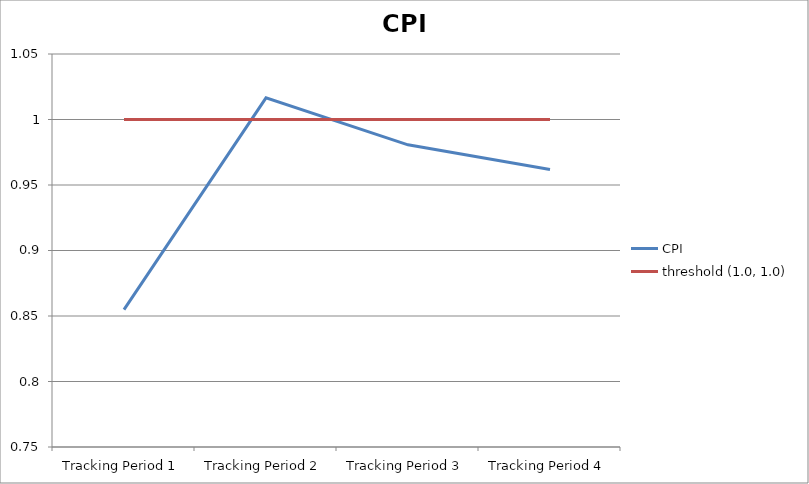
| Category | CPI | threshold (1.0, 1.0) |
|---|---|---|
| Tracking Period 1 | 0.855 | 1 |
| Tracking Period 2 | 1.017 | 1 |
| Tracking Period 3 | 0.981 | 1 |
| Tracking Period 4 | 0.962 | 1 |